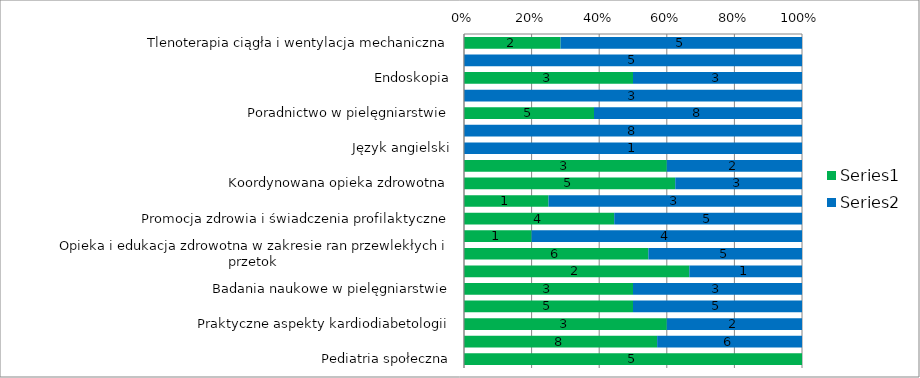
| Category | Series 0 | Series 1 |
|---|---|---|
| Tlenoterapia ciągła i wentylacja mechaniczna | 2 | 5 |
| Tlenoterapia ciągła i wentylacja mechaniczna - praktyka zawodowa | 0 | 5 |
| Endoskopia | 3 | 3 |
| Endoskopia - praktyka zawodowa | 0 | 3 |
| Poradnictwo w pielęgniarstwie | 5 | 8 |
| Poradnictwo w pielęgniarstwie - praktyka zawodowa | 0 | 8 |
| Język angielski | 0 | 1 |
| Dydaktyka medyczna | 3 | 2 |
| Koordynowana opieka zdrowotna | 5 | 3 |
| Leczenie żywieniowe | 1 | 3 |
| Promocja zdrowia i świadczenia profilaktyczne | 4 | 5 |
| Opieka i edukacja zdrowotna w chorobach przewlekłych (leczenie p. bólowe) | 1 | 4 |
| Opieka i edukacja zdrowotna w zakresie ran przewlekłych i przetok  | 6 | 5 |
| Opieka i edukacja w transplantologii | 2 | 1 |
| Badania naukowe w pielęgniarstwie | 3 | 3 |
| Wybrane zagadnienia w neurologii dziecięcej | 5 | 5 |
| Praktyczne aspekty kardiodiabetologii | 3 | 2 |
| Chirurgia jednego dnia | 8 | 6 |
| Pediatria społeczna | 5 | 0 |